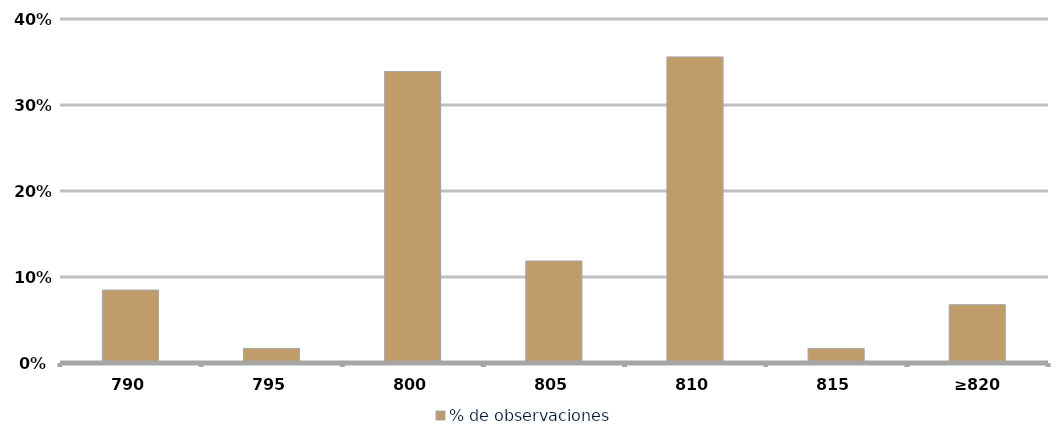
| Category | % de observaciones  |
|---|---|
|  790  | 0.085 |
|  795  | 0.017 |
|  800  | 0.339 |
|  805  | 0.119 |
|  810  | 0.356 |
| 815 | 0.017 |
|  ≥820  | 0.068 |